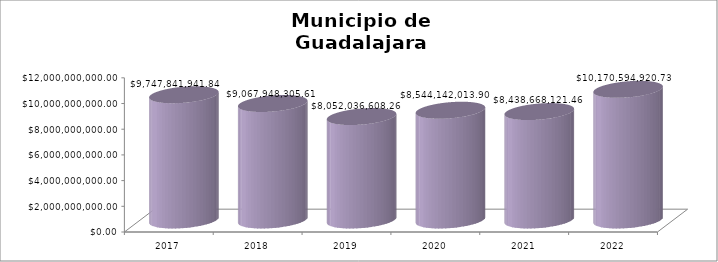
| Category | Municipio de Guadalajara
Gastos o egresos (total) |
|---|---|
| 0 | 9747841941.84 |
| 1 | 9067948305.61 |
| 2 | 8052036608.26 |
| 3 | 8544142013.9 |
| 4 | 8438668121.46 |
| 5 | 10170594920.73 |